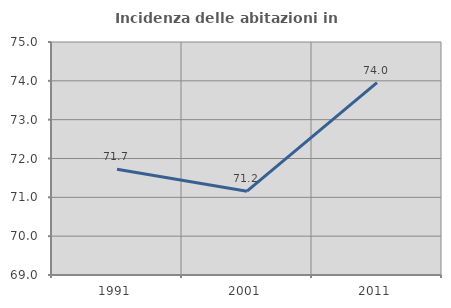
| Category | Incidenza delle abitazioni in proprietà  |
|---|---|
| 1991.0 | 71.721 |
| 2001.0 | 71.158 |
| 2011.0 | 73.952 |